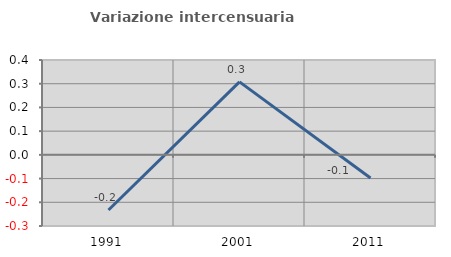
| Category | Variazione intercensuaria annua |
|---|---|
| 1991.0 | -0.232 |
| 2001.0 | 0.308 |
| 2011.0 | -0.097 |